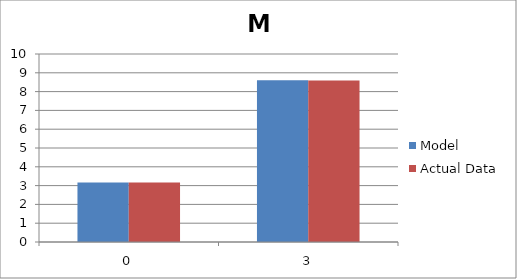
| Category | Model | Actual Data |
|---|---|---|
| 0.0 | 3.16 | 3.16 |
| 3.0 | 8.6 | 8.59 |